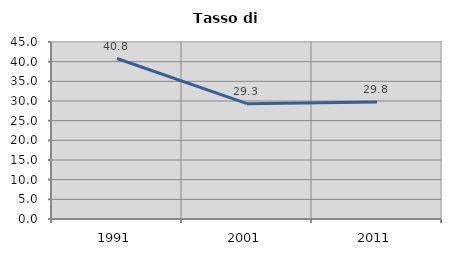
| Category | Tasso di disoccupazione   |
|---|---|
| 1991.0 | 40.805 |
| 2001.0 | 29.323 |
| 2011.0 | 29.752 |